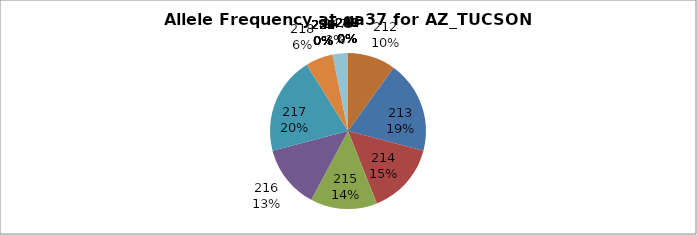
| Category | Series 0 |
|---|---|
| 207.0 | 0 |
| 208.0 | 0 |
| 209.0 | 0 |
| 210.0 | 0 |
| 211.0 | 0 |
| 212.0 | 0.099 |
| 213.0 | 0.191 |
| 214.0 | 0.149 |
| 215.0 | 0.138 |
| 216.0 | 0.131 |
| 217.0 | 0.202 |
| 218.0 | 0.057 |
| 226.0 | 0 |
| 227.0 | 0 |
| 228.0 | 0 |
| 229.0 | 0 |
| 230.0 | 0 |
| 231.0 | 0 |
| 232.0 | 0 |
| 234.0 | 0 |
| 239.0 | 0 |
| 240.0 | 0 |
| 247.0 | 0.032 |
| 248.0 | 0 |
| 249.0 | 0 |
| 250.0 | 0 |